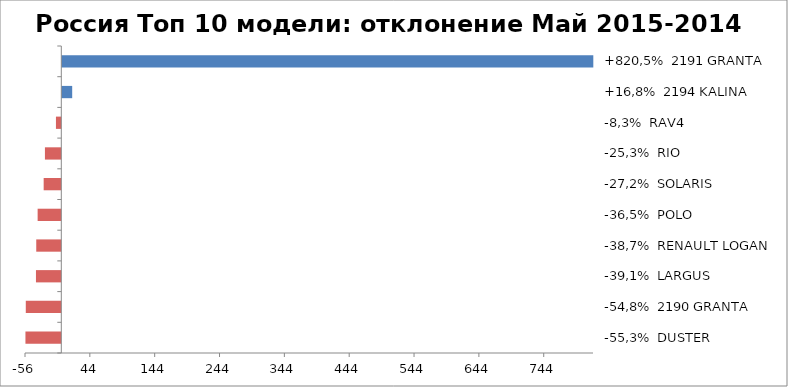
| Category | Россия Топ 10 модели: отклонение Май 2015-2014 |
|---|---|
| -55,3%  DUSTER | -55.313 |
| -54,8%  2190 GRANTA | -54.779 |
| -39,1%  LARGUS | -39.096 |
| -38,7%  RENAULT LOGAN | -38.654 |
| -36,5%  POLO | -36.515 |
| -27,2%  SOLARIS | -27.218 |
| -25,3%  RIO | -25.274 |
| -8,3%  RAV4 | -8.278 |
| +16,8%  2194 KALINA | 16.787 |
| +820,5%  2191 GRANTA | 820.471 |